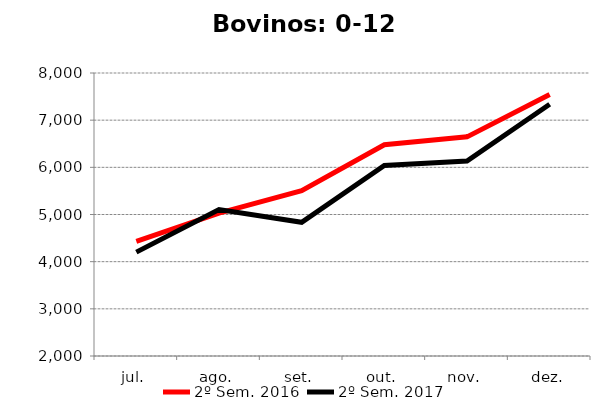
| Category | 2º Sem. 2016 | 2º Sem. 2017 |
|---|---|---|
| jul. | 4431 | 4202 |
| ago. | 5030 | 5105 |
| set. | 5505 | 4834 |
| out. | 6479 | 6039 |
| nov. | 6646 | 6132 |
| dez. | 7545 | 7338 |